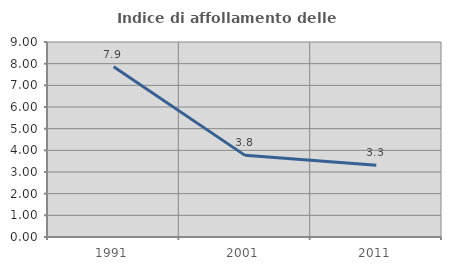
| Category | Indice di affollamento delle abitazioni  |
|---|---|
| 1991.0 | 7.859 |
| 2001.0 | 3.768 |
| 2011.0 | 3.311 |